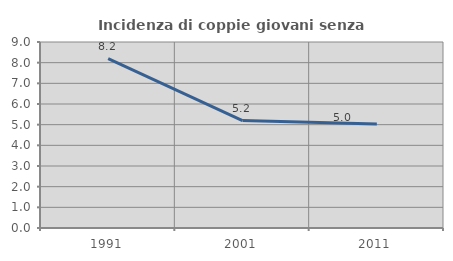
| Category | Incidenza di coppie giovani senza figli |
|---|---|
| 1991.0 | 8.2 |
| 2001.0 | 5.197 |
| 2011.0 | 5.03 |